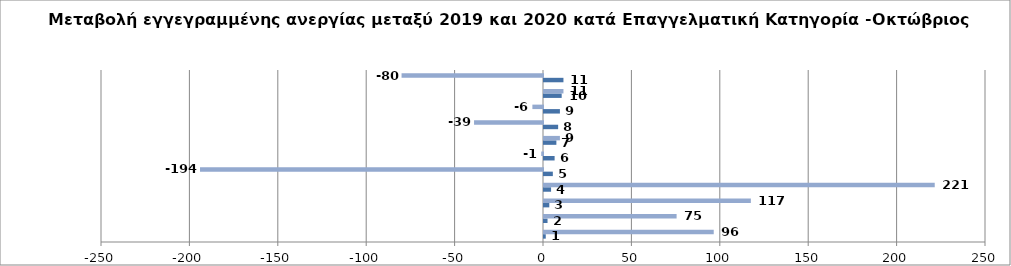
| Category | Series 0 | Series 1 |
|---|---|---|
| 0 | 1 | 96 |
| 1 | 2 | 75 |
| 2 | 3 | 117 |
| 3 | 4 | 221 |
| 4 | 5 | -194 |
| 5 | 6 | -1 |
| 6 | 7 | 9 |
| 7 | 8 | -39 |
| 8 | 9 | -6 |
| 9 | 10 | 11 |
| 10 | 11 | -80 |